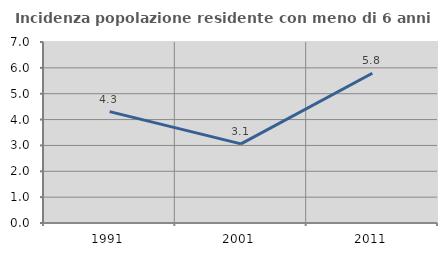
| Category | Incidenza popolazione residente con meno di 6 anni |
|---|---|
| 1991.0 | 4.306 |
| 2001.0 | 3.061 |
| 2011.0 | 5.789 |